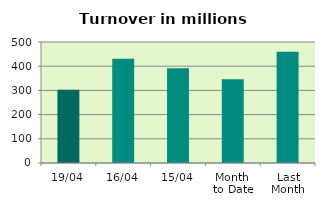
| Category | Series 0 |
|---|---|
| 19/04 | 302.414 |
| 16/04 | 431.261 |
| 15/04 | 391.537 |
| Month 
to Date | 345.58 |
| Last
Month | 459.546 |